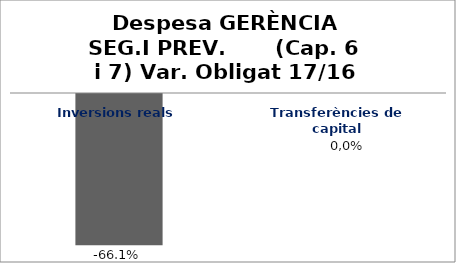
| Category | Series 0 |
|---|---|
| Inversions reals | -0.661 |
| Transferències de capital | 0 |